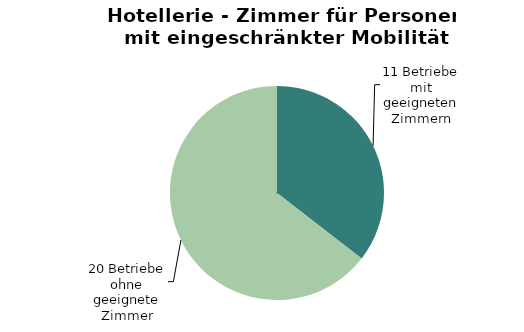
| Category | Series 0 |
|---|---|
|  | 11 |
|  | 20 |